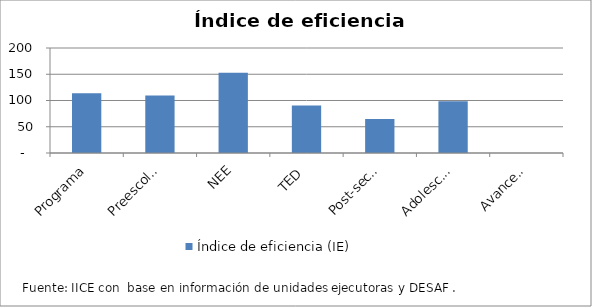
| Category | Índice de eficiencia (IE)  |
|---|---|
| Programa | 114.036 |
| Preescolar y Primaria | 109.648 |
| NEE | 152.715 |
| TED | 90.482 |
| Post-secundaria Regular | 64.624 |
| Adolesc. Padres y Madres | 98.679 |
| Avancemos más | 0 |